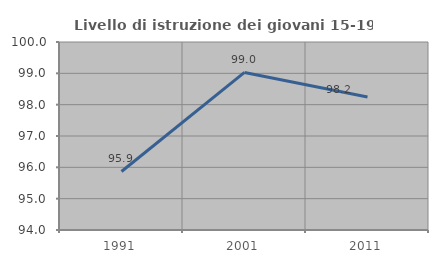
| Category | Livello di istruzione dei giovani 15-19 anni |
|---|---|
| 1991.0 | 95.868 |
| 2001.0 | 99.029 |
| 2011.0 | 98.246 |